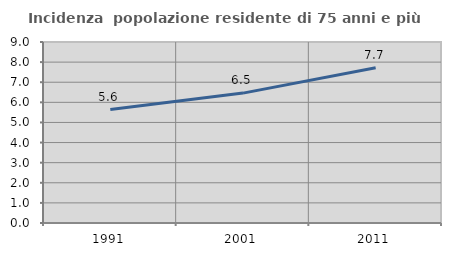
| Category | Incidenza  popolazione residente di 75 anni e più |
|---|---|
| 1991.0 | 5.64 |
| 2001.0 | 6.458 |
| 2011.0 | 7.724 |